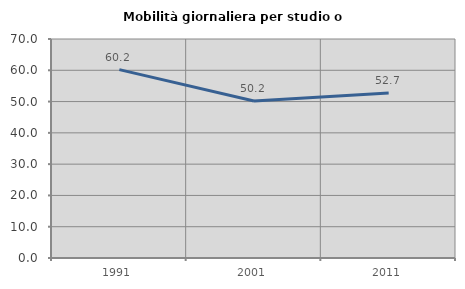
| Category | Mobilità giornaliera per studio o lavoro |
|---|---|
| 1991.0 | 60.204 |
| 2001.0 | 50.158 |
| 2011.0 | 52.746 |